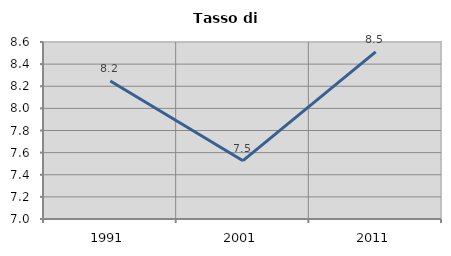
| Category | Tasso di disoccupazione   |
|---|---|
| 1991.0 | 8.247 |
| 2001.0 | 7.527 |
| 2011.0 | 8.511 |